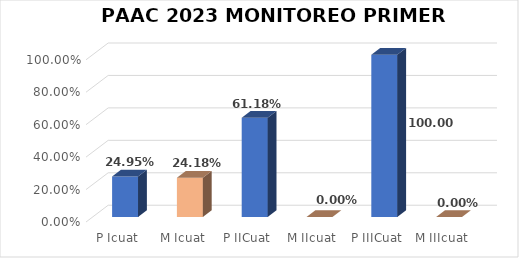
| Category | Series 0 |
|---|---|
| P Icuat | 0.249 |
| M Icuat | 0.242 |
| P IICuat | 0.612 |
| M IIcuat | 0 |
| P IIICuat | 1 |
| M IIIcuat | 0 |